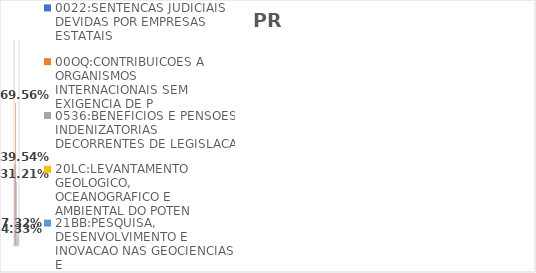
| Category | 0022:SENTENCAS JUDICIAIS DEVIDAS POR EMPRESAS ESTATAIS | 00OQ:CONTRIBUICOES A ORGANISMOS INTERNACIONAIS SEM EXIGENCIA DE P | 0536:BENEFICIOS E PENSOES INDENIZATORIAS DECORRENTES DE LEGISLACA | 20LC:LEVANTAMENTO GEOLOGICO, OCEANOGRAFICO E AMBIENTAL DO POTEN | 21BB:PESQUISA, DESENVOLVIMENTO E INOVACAO NAS GEOCIENCIAS E |
|---|---|---|---|---|---|
| EXECUTADO | 0.395 | 0.696 | 0.312 | 0.043 | 0.073 |